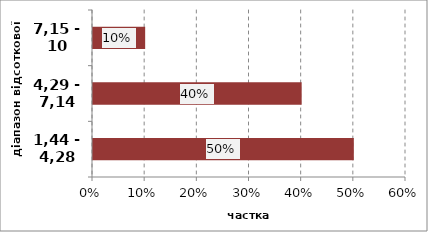
| Category | Series 0 |
|---|---|
| 1,44 - 4,28 | 0.5 |
| 4,29 - 7,14 | 0.4 |
| 7,15 - 10 | 0.1 |